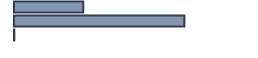
| Category | Percentatge |
|---|---|
| 0 | 28.869 |
| 1 | 70.997 |
| 2 | 0.134 |